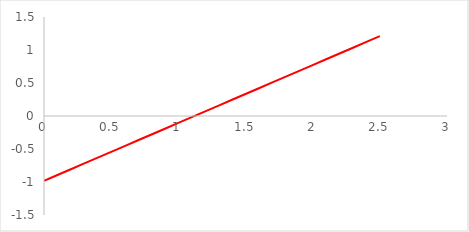
| Category | Series 0 |
|---|---|
| 0.0 | -0.982 |
| 0.1 | -0.894 |
| 0.2 | -0.806 |
| 0.30000000000000004 | -0.719 |
| 0.4 | -0.631 |
| 0.5 | -0.543 |
| 0.6 | -0.456 |
| 0.7 | -0.368 |
| 0.7999999999999999 | -0.28 |
| 0.8999999999999999 | -0.193 |
| 0.9999999999999999 | -0.105 |
| 1.0999999999999999 | -0.017 |
| 1.2 | 0.07 |
| 1.3 | 0.158 |
| 1.4000000000000001 | 0.246 |
| 1.5000000000000002 | 0.333 |
| 1.6000000000000003 | 0.421 |
| 1.7000000000000004 | 0.509 |
| 1.8000000000000005 | 0.596 |
| 1.9000000000000006 | 0.684 |
| 2.0000000000000004 | 0.772 |
| 2.1000000000000005 | 0.859 |
| 2.2000000000000006 | 0.947 |
| 2.3000000000000007 | 1.035 |
| 2.400000000000001 | 1.122 |
| 2.500000000000001 | 1.21 |